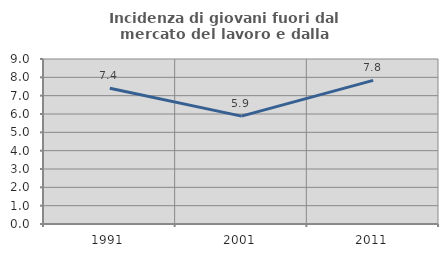
| Category | Incidenza di giovani fuori dal mercato del lavoro e dalla formazione  |
|---|---|
| 1991.0 | 7.403 |
| 2001.0 | 5.882 |
| 2011.0 | 7.833 |